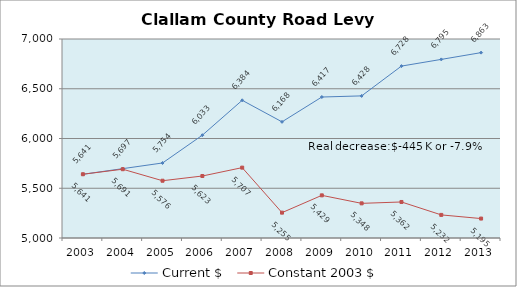
| Category | Current $ | Constant 2003 $ |
|---|---|---|
| 2003.0 | 5640.666 | 5640.666 |
| 2004.0 | 5697.072 | 5691.375 |
| 2005.0 | 5754.043 | 5575.668 |
| 2006.0 | 6033.344 | 5623.077 |
| 2007.0 | 6383.945 | 5707.247 |
| 2008.0 | 6167.516 | 5254.724 |
| 2009.0 | 6416.779 | 5428.595 |
| 2010.0 | 6428.235 | 5348.292 |
| 2011.0 | 6727.746 | 5362.014 |
| 2012.0 | 6795.023 | 5232.168 |
| 2013.0 | 6862.974 | 5195.271 |